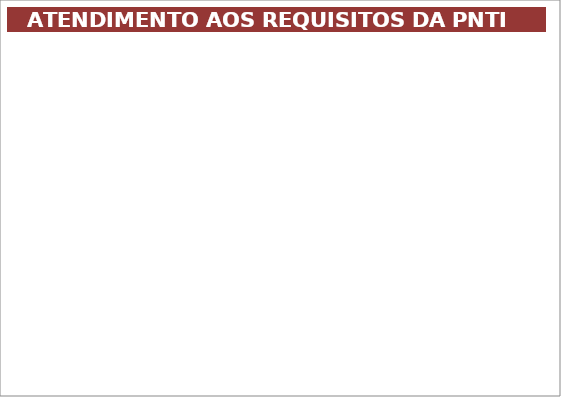
| Category | Series 0 |
|---|---|
| Não Atende | 0 |
| Possui Plano para Atender | 0 |
| Atende Parcialmente | 0 |
| Atende Integralmente | 0 |